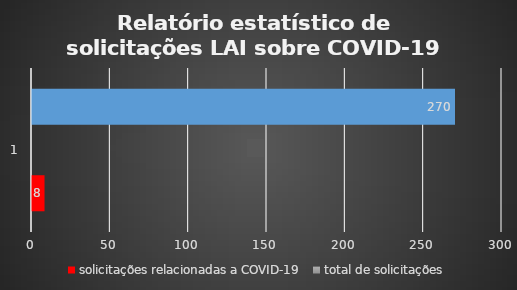
| Category | solicitações relacionadas a COVID-19 | solicitações em aberto | total de solicitações |
|---|---|---|---|
| 0 | 8 | 0 | 270 |